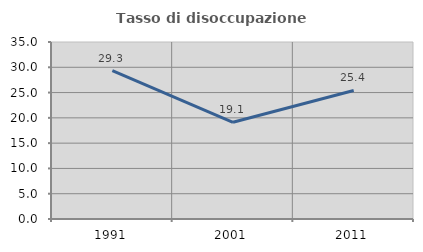
| Category | Tasso di disoccupazione giovanile  |
|---|---|
| 1991.0 | 29.343 |
| 2001.0 | 19.13 |
| 2011.0 | 25.424 |